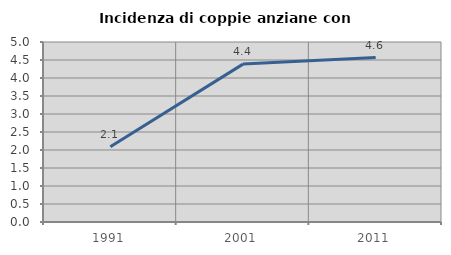
| Category | Incidenza di coppie anziane con figli |
|---|---|
| 1991.0 | 2.092 |
| 2001.0 | 4.386 |
| 2011.0 | 4.569 |